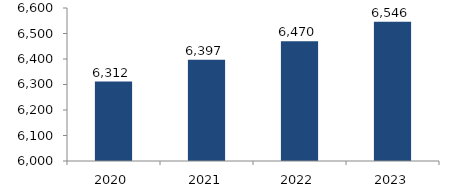
| Category | Bogotá |
|---|---|
| 2020.0 | 6311.639 |
| 2021.0 | 6396.855 |
| 2022.0 | 6469.914 |
| 2023.0 | 6546.335 |